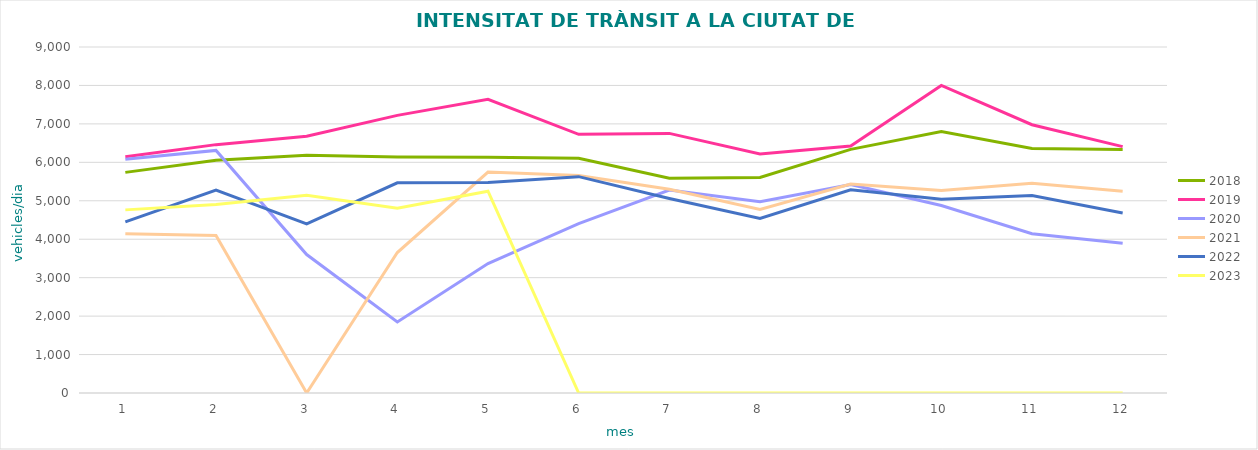
| Category | 2018 | 2019 | 2020 | 2021 | 2022 | 2023 |
|---|---|---|---|---|---|---|
| 0 | 5738.803 | 6142.693 | 6080.72 | 4139.6 | 4451.627 | 4763.398 |
| 1 | 6055.439 | 6460.333 | 6310.587 | 4096.6 | 5275.152 | 4900.753 |
| 2 | 6183.924 | 6680.768 | 3601.594 | 0 | 4401.192 | 5144.04 |
| 3 | 6137.145 | 7221.188 | 1847.675 | 3653.733 | 5468.519 | 4806.935 |
| 4 | 6133.188 | 7637.377 | 3366.964 | 5747.547 | 5477.02 | 5248.437 |
| 5 | 6105.522 | 6729.16 | 4405.945 | 5656.427 | 5627.379 | 0 |
| 6 | 5584.942 | 6752.787 | 5278.683 | 5301.413 | 5057.364 | 0 |
| 7 | 5607.427 | 6219.507 | 4977.571 | 4771.773 | 4539.462 | 0 |
| 8 | 6337 | 6422.253 | 5420.101 | 5436.072 | 5286.527 | 0 |
| 9 | 6802.147 | 8000 | 4877.533 | 5265.12 | 5040.023 | 0 |
| 10 | 6360.267 | 6978.44 | 4142.36 | 5452.613 | 5136.276 | 0 |
| 11 | 6334.987 | 6407.653 | 3892.947 | 5245.873 | 4682.75 | 0 |